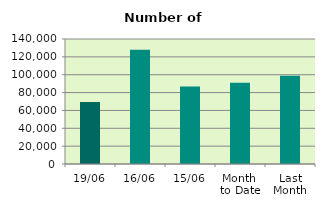
| Category | Series 0 |
|---|---|
| 19/06 | 69420 |
| 16/06 | 127848 |
| 15/06 | 86796 |
| Month 
to Date | 91073.538 |
| Last
Month | 98885.545 |